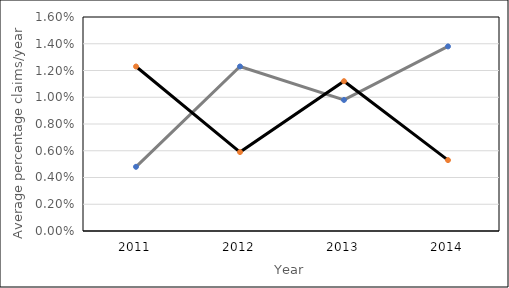
| Category | 6 | 7 |
|---|---|---|
| 0 | 0.005 | 0.012 |
| 1 | 0.012 | 0.006 |
| 2 | 0.01 | 0.011 |
| 3 | 0.014 | 0.005 |